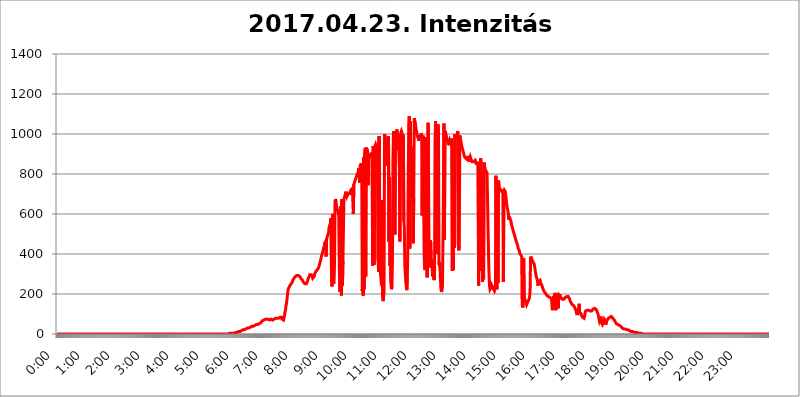
| Category | 2017.04.23. Intenzitás [W/m^2] |
|---|---|
| 0.0 | 0 |
| 0.0006944444444444445 | 0 |
| 0.001388888888888889 | 0 |
| 0.0020833333333333333 | 0 |
| 0.002777777777777778 | 0 |
| 0.003472222222222222 | 0 |
| 0.004166666666666667 | 0 |
| 0.004861111111111111 | 0 |
| 0.005555555555555556 | 0 |
| 0.0062499999999999995 | 0 |
| 0.006944444444444444 | 0 |
| 0.007638888888888889 | 0 |
| 0.008333333333333333 | 0 |
| 0.009027777777777779 | 0 |
| 0.009722222222222222 | 0 |
| 0.010416666666666666 | 0 |
| 0.011111111111111112 | 0 |
| 0.011805555555555555 | 0 |
| 0.012499999999999999 | 0 |
| 0.013194444444444444 | 0 |
| 0.013888888888888888 | 0 |
| 0.014583333333333332 | 0 |
| 0.015277777777777777 | 0 |
| 0.015972222222222224 | 0 |
| 0.016666666666666666 | 0 |
| 0.017361111111111112 | 0 |
| 0.018055555555555557 | 0 |
| 0.01875 | 0 |
| 0.019444444444444445 | 0 |
| 0.02013888888888889 | 0 |
| 0.020833333333333332 | 0 |
| 0.02152777777777778 | 0 |
| 0.022222222222222223 | 0 |
| 0.02291666666666667 | 0 |
| 0.02361111111111111 | 0 |
| 0.024305555555555556 | 0 |
| 0.024999999999999998 | 0 |
| 0.025694444444444447 | 0 |
| 0.02638888888888889 | 0 |
| 0.027083333333333334 | 0 |
| 0.027777777777777776 | 0 |
| 0.02847222222222222 | 0 |
| 0.029166666666666664 | 0 |
| 0.029861111111111113 | 0 |
| 0.030555555555555555 | 0 |
| 0.03125 | 0 |
| 0.03194444444444445 | 0 |
| 0.03263888888888889 | 0 |
| 0.03333333333333333 | 0 |
| 0.034027777777777775 | 0 |
| 0.034722222222222224 | 0 |
| 0.035416666666666666 | 0 |
| 0.036111111111111115 | 0 |
| 0.03680555555555556 | 0 |
| 0.0375 | 0 |
| 0.03819444444444444 | 0 |
| 0.03888888888888889 | 0 |
| 0.03958333333333333 | 0 |
| 0.04027777777777778 | 0 |
| 0.04097222222222222 | 0 |
| 0.041666666666666664 | 0 |
| 0.042361111111111106 | 0 |
| 0.04305555555555556 | 0 |
| 0.043750000000000004 | 0 |
| 0.044444444444444446 | 0 |
| 0.04513888888888889 | 0 |
| 0.04583333333333334 | 0 |
| 0.04652777777777778 | 0 |
| 0.04722222222222222 | 0 |
| 0.04791666666666666 | 0 |
| 0.04861111111111111 | 0 |
| 0.049305555555555554 | 0 |
| 0.049999999999999996 | 0 |
| 0.05069444444444445 | 0 |
| 0.051388888888888894 | 0 |
| 0.052083333333333336 | 0 |
| 0.05277777777777778 | 0 |
| 0.05347222222222222 | 0 |
| 0.05416666666666667 | 0 |
| 0.05486111111111111 | 0 |
| 0.05555555555555555 | 0 |
| 0.05625 | 0 |
| 0.05694444444444444 | 0 |
| 0.057638888888888885 | 0 |
| 0.05833333333333333 | 0 |
| 0.05902777777777778 | 0 |
| 0.059722222222222225 | 0 |
| 0.06041666666666667 | 0 |
| 0.061111111111111116 | 0 |
| 0.06180555555555556 | 0 |
| 0.0625 | 0 |
| 0.06319444444444444 | 0 |
| 0.06388888888888888 | 0 |
| 0.06458333333333334 | 0 |
| 0.06527777777777778 | 0 |
| 0.06597222222222222 | 0 |
| 0.06666666666666667 | 0 |
| 0.06736111111111111 | 0 |
| 0.06805555555555555 | 0 |
| 0.06874999999999999 | 0 |
| 0.06944444444444443 | 0 |
| 0.07013888888888889 | 0 |
| 0.07083333333333333 | 0 |
| 0.07152777777777779 | 0 |
| 0.07222222222222223 | 0 |
| 0.07291666666666667 | 0 |
| 0.07361111111111111 | 0 |
| 0.07430555555555556 | 0 |
| 0.075 | 0 |
| 0.07569444444444444 | 0 |
| 0.0763888888888889 | 0 |
| 0.07708333333333334 | 0 |
| 0.07777777777777778 | 0 |
| 0.07847222222222222 | 0 |
| 0.07916666666666666 | 0 |
| 0.0798611111111111 | 0 |
| 0.08055555555555556 | 0 |
| 0.08125 | 0 |
| 0.08194444444444444 | 0 |
| 0.08263888888888889 | 0 |
| 0.08333333333333333 | 0 |
| 0.08402777777777777 | 0 |
| 0.08472222222222221 | 0 |
| 0.08541666666666665 | 0 |
| 0.08611111111111112 | 0 |
| 0.08680555555555557 | 0 |
| 0.08750000000000001 | 0 |
| 0.08819444444444445 | 0 |
| 0.08888888888888889 | 0 |
| 0.08958333333333333 | 0 |
| 0.09027777777777778 | 0 |
| 0.09097222222222222 | 0 |
| 0.09166666666666667 | 0 |
| 0.09236111111111112 | 0 |
| 0.09305555555555556 | 0 |
| 0.09375 | 0 |
| 0.09444444444444444 | 0 |
| 0.09513888888888888 | 0 |
| 0.09583333333333333 | 0 |
| 0.09652777777777777 | 0 |
| 0.09722222222222222 | 0 |
| 0.09791666666666667 | 0 |
| 0.09861111111111111 | 0 |
| 0.09930555555555555 | 0 |
| 0.09999999999999999 | 0 |
| 0.10069444444444443 | 0 |
| 0.1013888888888889 | 0 |
| 0.10208333333333335 | 0 |
| 0.10277777777777779 | 0 |
| 0.10347222222222223 | 0 |
| 0.10416666666666667 | 0 |
| 0.10486111111111111 | 0 |
| 0.10555555555555556 | 0 |
| 0.10625 | 0 |
| 0.10694444444444444 | 0 |
| 0.1076388888888889 | 0 |
| 0.10833333333333334 | 0 |
| 0.10902777777777778 | 0 |
| 0.10972222222222222 | 0 |
| 0.1111111111111111 | 0 |
| 0.11180555555555556 | 0 |
| 0.11180555555555556 | 0 |
| 0.1125 | 0 |
| 0.11319444444444444 | 0 |
| 0.11388888888888889 | 0 |
| 0.11458333333333333 | 0 |
| 0.11527777777777777 | 0 |
| 0.11597222222222221 | 0 |
| 0.11666666666666665 | 0 |
| 0.1173611111111111 | 0 |
| 0.11805555555555557 | 0 |
| 0.11944444444444445 | 0 |
| 0.12013888888888889 | 0 |
| 0.12083333333333333 | 0 |
| 0.12152777777777778 | 0 |
| 0.12222222222222223 | 0 |
| 0.12291666666666667 | 0 |
| 0.12291666666666667 | 0 |
| 0.12361111111111112 | 0 |
| 0.12430555555555556 | 0 |
| 0.125 | 0 |
| 0.12569444444444444 | 0 |
| 0.12638888888888888 | 0 |
| 0.12708333333333333 | 0 |
| 0.16875 | 0 |
| 0.12847222222222224 | 0 |
| 0.12916666666666668 | 0 |
| 0.12986111111111112 | 0 |
| 0.13055555555555556 | 0 |
| 0.13125 | 0 |
| 0.13194444444444445 | 0 |
| 0.1326388888888889 | 0 |
| 0.13333333333333333 | 0 |
| 0.13402777777777777 | 0 |
| 0.13402777777777777 | 0 |
| 0.13472222222222222 | 0 |
| 0.13541666666666666 | 0 |
| 0.1361111111111111 | 0 |
| 0.13749999999999998 | 0 |
| 0.13819444444444443 | 0 |
| 0.1388888888888889 | 0 |
| 0.13958333333333334 | 0 |
| 0.14027777777777778 | 0 |
| 0.14097222222222222 | 0 |
| 0.14166666666666666 | 0 |
| 0.1423611111111111 | 0 |
| 0.14305555555555557 | 0 |
| 0.14375000000000002 | 0 |
| 0.14444444444444446 | 0 |
| 0.1451388888888889 | 0 |
| 0.1451388888888889 | 0 |
| 0.14652777777777778 | 0 |
| 0.14722222222222223 | 0 |
| 0.14791666666666667 | 0 |
| 0.1486111111111111 | 0 |
| 0.14930555555555555 | 0 |
| 0.15 | 0 |
| 0.15069444444444444 | 0 |
| 0.15138888888888888 | 0 |
| 0.15208333333333332 | 0 |
| 0.15277777777777776 | 0 |
| 0.15347222222222223 | 0 |
| 0.15416666666666667 | 0 |
| 0.15486111111111112 | 0 |
| 0.15555555555555556 | 0 |
| 0.15625 | 0 |
| 0.15694444444444444 | 0 |
| 0.15763888888888888 | 0 |
| 0.15833333333333333 | 0 |
| 0.15902777777777777 | 0 |
| 0.15972222222222224 | 0 |
| 0.16041666666666668 | 0 |
| 0.16111111111111112 | 0 |
| 0.16180555555555556 | 0 |
| 0.1625 | 0 |
| 0.16319444444444445 | 0 |
| 0.1638888888888889 | 0 |
| 0.16458333333333333 | 0 |
| 0.16527777777777777 | 0 |
| 0.16597222222222222 | 0 |
| 0.16666666666666666 | 0 |
| 0.1673611111111111 | 0 |
| 0.16805555555555554 | 0 |
| 0.16874999999999998 | 0 |
| 0.16944444444444443 | 0 |
| 0.17013888888888887 | 0 |
| 0.1708333333333333 | 0 |
| 0.17152777777777775 | 0 |
| 0.17222222222222225 | 0 |
| 0.1729166666666667 | 0 |
| 0.17361111111111113 | 0 |
| 0.17430555555555557 | 0 |
| 0.17500000000000002 | 0 |
| 0.17569444444444446 | 0 |
| 0.1763888888888889 | 0 |
| 0.17708333333333334 | 0 |
| 0.17777777777777778 | 0 |
| 0.17847222222222223 | 0 |
| 0.17916666666666667 | 0 |
| 0.1798611111111111 | 0 |
| 0.18055555555555555 | 0 |
| 0.18125 | 0 |
| 0.18194444444444444 | 0 |
| 0.1826388888888889 | 0 |
| 0.18333333333333335 | 0 |
| 0.1840277777777778 | 0 |
| 0.18472222222222223 | 0 |
| 0.18541666666666667 | 0 |
| 0.18611111111111112 | 0 |
| 0.18680555555555556 | 0 |
| 0.1875 | 0 |
| 0.18819444444444444 | 0 |
| 0.18888888888888888 | 0 |
| 0.18958333333333333 | 0 |
| 0.19027777777777777 | 0 |
| 0.1909722222222222 | 0 |
| 0.19166666666666665 | 0 |
| 0.19236111111111112 | 0 |
| 0.19305555555555554 | 0 |
| 0.19375 | 0 |
| 0.19444444444444445 | 0 |
| 0.1951388888888889 | 0 |
| 0.19583333333333333 | 0 |
| 0.19652777777777777 | 0 |
| 0.19722222222222222 | 0 |
| 0.19791666666666666 | 0 |
| 0.1986111111111111 | 0 |
| 0.19930555555555554 | 0 |
| 0.19999999999999998 | 0 |
| 0.20069444444444443 | 0 |
| 0.20138888888888887 | 0 |
| 0.2020833333333333 | 0 |
| 0.2027777777777778 | 0 |
| 0.2034722222222222 | 0 |
| 0.2041666666666667 | 0 |
| 0.20486111111111113 | 0 |
| 0.20555555555555557 | 0 |
| 0.20625000000000002 | 0 |
| 0.20694444444444446 | 0 |
| 0.2076388888888889 | 0 |
| 0.20833333333333334 | 0 |
| 0.20902777777777778 | 0 |
| 0.20972222222222223 | 0 |
| 0.21041666666666667 | 0 |
| 0.2111111111111111 | 0 |
| 0.21180555555555555 | 0 |
| 0.2125 | 0 |
| 0.21319444444444444 | 0 |
| 0.2138888888888889 | 0 |
| 0.21458333333333335 | 0 |
| 0.2152777777777778 | 0 |
| 0.21597222222222223 | 0 |
| 0.21666666666666667 | 0 |
| 0.21736111111111112 | 0 |
| 0.21805555555555556 | 0 |
| 0.21875 | 0 |
| 0.21944444444444444 | 0 |
| 0.22013888888888888 | 0 |
| 0.22083333333333333 | 0 |
| 0.22152777777777777 | 0 |
| 0.2222222222222222 | 0 |
| 0.22291666666666665 | 0 |
| 0.2236111111111111 | 0 |
| 0.22430555555555556 | 0 |
| 0.225 | 0 |
| 0.22569444444444445 | 0 |
| 0.2263888888888889 | 0 |
| 0.22708333333333333 | 0 |
| 0.22777777777777777 | 0 |
| 0.22847222222222222 | 0 |
| 0.22916666666666666 | 0 |
| 0.2298611111111111 | 0 |
| 0.23055555555555554 | 0 |
| 0.23124999999999998 | 0 |
| 0.23194444444444443 | 0 |
| 0.23263888888888887 | 0 |
| 0.2333333333333333 | 0 |
| 0.2340277777777778 | 0 |
| 0.2347222222222222 | 0 |
| 0.2354166666666667 | 0 |
| 0.23611111111111113 | 0 |
| 0.23680555555555557 | 0 |
| 0.23750000000000002 | 0 |
| 0.23819444444444446 | 0 |
| 0.2388888888888889 | 0 |
| 0.23958333333333334 | 0 |
| 0.24027777777777778 | 0 |
| 0.24097222222222223 | 0 |
| 0.24166666666666667 | 3.525 |
| 0.2423611111111111 | 3.525 |
| 0.24305555555555555 | 3.525 |
| 0.24375 | 3.525 |
| 0.24444444444444446 | 3.525 |
| 0.24513888888888888 | 3.525 |
| 0.24583333333333335 | 3.525 |
| 0.2465277777777778 | 3.525 |
| 0.24722222222222223 | 3.525 |
| 0.24791666666666667 | 3.525 |
| 0.24861111111111112 | 7.887 |
| 0.24930555555555556 | 7.887 |
| 0.25 | 7.887 |
| 0.25069444444444444 | 7.887 |
| 0.2513888888888889 | 7.887 |
| 0.2520833333333333 | 7.887 |
| 0.25277777777777777 | 7.887 |
| 0.2534722222222222 | 12.257 |
| 0.25416666666666665 | 12.257 |
| 0.2548611111111111 | 12.257 |
| 0.2555555555555556 | 12.257 |
| 0.25625000000000003 | 12.257 |
| 0.2569444444444445 | 12.257 |
| 0.2576388888888889 | 16.636 |
| 0.25833333333333336 | 16.636 |
| 0.2590277777777778 | 16.636 |
| 0.25972222222222224 | 16.636 |
| 0.2604166666666667 | 21.024 |
| 0.2611111111111111 | 21.024 |
| 0.26180555555555557 | 21.024 |
| 0.2625 | 21.024 |
| 0.26319444444444445 | 25.419 |
| 0.2638888888888889 | 25.419 |
| 0.26458333333333334 | 25.419 |
| 0.2652777777777778 | 25.419 |
| 0.2659722222222222 | 29.823 |
| 0.26666666666666666 | 29.823 |
| 0.2673611111111111 | 29.823 |
| 0.26805555555555555 | 29.823 |
| 0.26875 | 29.823 |
| 0.26944444444444443 | 29.823 |
| 0.2701388888888889 | 34.234 |
| 0.2708333333333333 | 34.234 |
| 0.27152777777777776 | 34.234 |
| 0.2722222222222222 | 38.653 |
| 0.27291666666666664 | 38.653 |
| 0.2736111111111111 | 38.653 |
| 0.2743055555555555 | 38.653 |
| 0.27499999999999997 | 38.653 |
| 0.27569444444444446 | 38.653 |
| 0.27638888888888885 | 43.079 |
| 0.27708333333333335 | 43.079 |
| 0.2777777777777778 | 43.079 |
| 0.27847222222222223 | 43.079 |
| 0.2791666666666667 | 47.511 |
| 0.2798611111111111 | 47.511 |
| 0.28055555555555556 | 47.511 |
| 0.28125 | 47.511 |
| 0.28194444444444444 | 51.951 |
| 0.2826388888888889 | 51.951 |
| 0.2833333333333333 | 51.951 |
| 0.28402777777777777 | 56.398 |
| 0.2847222222222222 | 56.398 |
| 0.28541666666666665 | 56.398 |
| 0.28611111111111115 | 60.85 |
| 0.28680555555555554 | 60.85 |
| 0.28750000000000003 | 65.31 |
| 0.2881944444444445 | 65.31 |
| 0.2888888888888889 | 69.775 |
| 0.28958333333333336 | 69.775 |
| 0.2902777777777778 | 74.246 |
| 0.29097222222222224 | 74.246 |
| 0.2916666666666667 | 74.246 |
| 0.2923611111111111 | 74.246 |
| 0.29305555555555557 | 74.246 |
| 0.29375 | 74.246 |
| 0.29444444444444445 | 74.246 |
| 0.2951388888888889 | 74.246 |
| 0.29583333333333334 | 74.246 |
| 0.2965277777777778 | 69.775 |
| 0.2972222222222222 | 69.775 |
| 0.29791666666666666 | 69.775 |
| 0.2986111111111111 | 74.246 |
| 0.29930555555555555 | 74.246 |
| 0.3 | 74.246 |
| 0.30069444444444443 | 74.246 |
| 0.3013888888888889 | 74.246 |
| 0.3020833333333333 | 69.775 |
| 0.30277777777777776 | 74.246 |
| 0.3034722222222222 | 74.246 |
| 0.30416666666666664 | 74.246 |
| 0.3048611111111111 | 78.722 |
| 0.3055555555555555 | 78.722 |
| 0.30624999999999997 | 78.722 |
| 0.3069444444444444 | 78.722 |
| 0.3076388888888889 | 78.722 |
| 0.30833333333333335 | 78.722 |
| 0.3090277777777778 | 78.722 |
| 0.30972222222222223 | 74.246 |
| 0.3104166666666667 | 78.722 |
| 0.3111111111111111 | 78.722 |
| 0.31180555555555556 | 83.205 |
| 0.3125 | 83.205 |
| 0.31319444444444444 | 83.205 |
| 0.3138888888888889 | 83.205 |
| 0.3145833333333333 | 83.205 |
| 0.31527777777777777 | 74.246 |
| 0.3159722222222222 | 69.775 |
| 0.31666666666666665 | 69.775 |
| 0.31736111111111115 | 69.775 |
| 0.31805555555555554 | 74.246 |
| 0.31875000000000003 | 92.184 |
| 0.3194444444444445 | 110.201 |
| 0.3201388888888889 | 119.235 |
| 0.32083333333333336 | 141.884 |
| 0.3215277777777778 | 150.964 |
| 0.32222222222222224 | 173.709 |
| 0.3229166666666667 | 178.264 |
| 0.3236111111111111 | 219.309 |
| 0.32430555555555557 | 228.436 |
| 0.325 | 233 |
| 0.32569444444444445 | 237.564 |
| 0.3263888888888889 | 242.127 |
| 0.32708333333333334 | 246.689 |
| 0.3277777777777778 | 251.251 |
| 0.3284722222222222 | 251.251 |
| 0.32916666666666666 | 255.813 |
| 0.3298611111111111 | 260.373 |
| 0.33055555555555555 | 269.49 |
| 0.33125 | 274.047 |
| 0.33194444444444443 | 278.603 |
| 0.3326388888888889 | 278.603 |
| 0.3333333333333333 | 283.156 |
| 0.3340277777777778 | 287.709 |
| 0.3347222222222222 | 292.259 |
| 0.3354166666666667 | 287.709 |
| 0.3361111111111111 | 292.259 |
| 0.3368055555555556 | 296.808 |
| 0.33749999999999997 | 292.259 |
| 0.33819444444444446 | 292.259 |
| 0.33888888888888885 | 292.259 |
| 0.33958333333333335 | 292.259 |
| 0.34027777777777773 | 287.709 |
| 0.34097222222222223 | 283.156 |
| 0.3416666666666666 | 278.603 |
| 0.3423611111111111 | 274.047 |
| 0.3430555555555555 | 274.047 |
| 0.34375 | 269.49 |
| 0.3444444444444445 | 269.49 |
| 0.3451388888888889 | 260.373 |
| 0.3458333333333334 | 255.813 |
| 0.34652777777777777 | 255.813 |
| 0.34722222222222227 | 251.251 |
| 0.34791666666666665 | 251.251 |
| 0.34861111111111115 | 251.251 |
| 0.34930555555555554 | 251.251 |
| 0.35000000000000003 | 255.813 |
| 0.3506944444444444 | 260.373 |
| 0.3513888888888889 | 269.49 |
| 0.3520833333333333 | 278.603 |
| 0.3527777777777778 | 283.156 |
| 0.3534722222222222 | 287.709 |
| 0.3541666666666667 | 296.808 |
| 0.3548611111111111 | 301.354 |
| 0.35555555555555557 | 301.354 |
| 0.35625 | 296.808 |
| 0.35694444444444445 | 292.259 |
| 0.3576388888888889 | 287.709 |
| 0.35833333333333334 | 278.603 |
| 0.3590277777777778 | 283.156 |
| 0.3597222222222222 | 283.156 |
| 0.36041666666666666 | 287.709 |
| 0.3611111111111111 | 301.354 |
| 0.36180555555555555 | 305.898 |
| 0.3625 | 305.898 |
| 0.36319444444444443 | 314.98 |
| 0.3638888888888889 | 314.98 |
| 0.3645833333333333 | 319.517 |
| 0.3652777777777778 | 324.052 |
| 0.3659722222222222 | 328.584 |
| 0.3666666666666667 | 333.113 |
| 0.3673611111111111 | 342.162 |
| 0.3680555555555556 | 351.198 |
| 0.36874999999999997 | 355.712 |
| 0.36944444444444446 | 369.23 |
| 0.37013888888888885 | 382.715 |
| 0.37083333333333335 | 391.685 |
| 0.37152777777777773 | 400.638 |
| 0.37222222222222223 | 409.574 |
| 0.3729166666666666 | 414.035 |
| 0.3736111111111111 | 427.39 |
| 0.3743055555555555 | 418.492 |
| 0.375 | 453.968 |
| 0.3756944444444445 | 449.551 |
| 0.3763888888888889 | 462.786 |
| 0.3770833333333334 | 387.202 |
| 0.37777777777777777 | 471.582 |
| 0.37847222222222227 | 484.735 |
| 0.37916666666666665 | 489.108 |
| 0.37986111111111115 | 480.356 |
| 0.38055555555555554 | 506.542 |
| 0.38125000000000003 | 532.513 |
| 0.3819444444444444 | 536.82 |
| 0.3826388888888889 | 549.704 |
| 0.3833333333333333 | 558.261 |
| 0.3840277777777778 | 579.542 |
| 0.3847222222222222 | 278.603 |
| 0.3854166666666667 | 237.564 |
| 0.3861111111111111 | 600.661 |
| 0.38680555555555557 | 489.108 |
| 0.3875 | 251.251 |
| 0.38819444444444445 | 260.373 |
| 0.3888888888888889 | 351.198 |
| 0.38958333333333334 | 663.019 |
| 0.3902777777777778 | 675.311 |
| 0.3909722222222222 | 658.909 |
| 0.39166666666666666 | 642.4 |
| 0.3923611111111111 | 625.784 |
| 0.39305555555555555 | 617.436 |
| 0.39375 | 613.252 |
| 0.39444444444444443 | 604.864 |
| 0.3951388888888889 | 613.252 |
| 0.3958333333333333 | 292.259 |
| 0.3965277777777778 | 210.182 |
| 0.3972222222222222 | 638.256 |
| 0.3979166666666667 | 588.009 |
| 0.3986111111111111 | 191.937 |
| 0.3993055555555556 | 675.311 |
| 0.39999999999999997 | 242.127 |
| 0.40069444444444446 | 364.728 |
| 0.40138888888888885 | 523.88 |
| 0.40208333333333335 | 675.311 |
| 0.40277777777777773 | 679.395 |
| 0.40347222222222223 | 691.608 |
| 0.4041666666666666 | 691.608 |
| 0.4048611111111111 | 711.832 |
| 0.4055555555555555 | 707.8 |
| 0.40625 | 687.544 |
| 0.4069444444444445 | 683.473 |
| 0.4076388888888889 | 683.473 |
| 0.4083333333333334 | 703.762 |
| 0.40902777777777777 | 703.762 |
| 0.40972222222222227 | 703.762 |
| 0.41041666666666665 | 703.762 |
| 0.41111111111111115 | 695.666 |
| 0.41180555555555554 | 719.877 |
| 0.41250000000000003 | 719.877 |
| 0.4131944444444444 | 719.877 |
| 0.4138888888888889 | 727.896 |
| 0.4145833333333333 | 723.889 |
| 0.4152777777777778 | 600.661 |
| 0.4159722222222222 | 747.834 |
| 0.4166666666666667 | 755.766 |
| 0.4173611111111111 | 759.723 |
| 0.41805555555555557 | 771.559 |
| 0.41875 | 775.492 |
| 0.41944444444444445 | 783.342 |
| 0.4201388888888889 | 795.074 |
| 0.42083333333333334 | 798.974 |
| 0.4215277777777778 | 802.868 |
| 0.4222222222222222 | 810.641 |
| 0.42291666666666666 | 829.981 |
| 0.4236111111111111 | 826.123 |
| 0.42430555555555555 | 755.766 |
| 0.425 | 841.526 |
| 0.42569444444444443 | 845.365 |
| 0.4263888888888889 | 853.029 |
| 0.4270833333333333 | 810.641 |
| 0.4277777777777778 | 214.746 |
| 0.4284722222222222 | 255.813 |
| 0.4291666666666667 | 191.937 |
| 0.4298611111111111 | 883.516 |
| 0.4305555555555556 | 223.873 |
| 0.43124999999999997 | 902.447 |
| 0.43194444444444446 | 928.819 |
| 0.43263888888888885 | 287.709 |
| 0.43333333333333335 | 932.576 |
| 0.43402777777777773 | 883.516 |
| 0.43472222222222223 | 925.06 |
| 0.4354166666666666 | 906.223 |
| 0.4361111111111111 | 743.859 |
| 0.4368055555555555 | 902.447 |
| 0.4375 | 894.885 |
| 0.4381944444444445 | 891.099 |
| 0.4388888888888889 | 894.885 |
| 0.4395833333333334 | 887.309 |
| 0.44027777777777777 | 887.309 |
| 0.44097222222222227 | 894.885 |
| 0.44166666666666665 | 909.996 |
| 0.44236111111111115 | 342.162 |
| 0.44305555555555554 | 940.082 |
| 0.44375000000000003 | 928.819 |
| 0.4444444444444444 | 346.682 |
| 0.4451388888888889 | 613.252 |
| 0.4458333333333333 | 940.082 |
| 0.4465277777777778 | 947.58 |
| 0.4472222222222222 | 940.082 |
| 0.4479166666666667 | 928.819 |
| 0.4486111111111111 | 921.298 |
| 0.44930555555555557 | 928.819 |
| 0.45 | 369.23 |
| 0.45069444444444445 | 310.44 |
| 0.4513888888888889 | 988.714 |
| 0.45208333333333334 | 378.224 |
| 0.4527777777777778 | 324.052 |
| 0.4534722222222222 | 296.808 |
| 0.45416666666666666 | 292.259 |
| 0.4548611111111111 | 242.127 |
| 0.45555555555555555 | 667.123 |
| 0.45625 | 187.378 |
| 0.45694444444444443 | 164.605 |
| 0.4576388888888889 | 182.82 |
| 0.4583333333333333 | 210.182 |
| 0.4590277777777778 | 999.916 |
| 0.4597222222222222 | 988.714 |
| 0.4604166666666667 | 981.244 |
| 0.4611111111111111 | 970.034 |
| 0.4618055555555556 | 966.295 |
| 0.46249999999999997 | 970.034 |
| 0.46319444444444446 | 841.526 |
| 0.46388888888888885 | 928.819 |
| 0.46458333333333335 | 988.714 |
| 0.46527777777777773 | 462.786 |
| 0.46597222222222223 | 783.342 |
| 0.4666666666666666 | 342.162 |
| 0.4673611111111111 | 378.224 |
| 0.4680555555555555 | 255.813 |
| 0.46875 | 223.873 |
| 0.4694444444444445 | 237.564 |
| 0.4701388888888889 | 369.23 |
| 0.4708333333333334 | 868.305 |
| 0.47152777777777777 | 1014.852 |
| 0.47222222222222227 | 1018.587 |
| 0.47291666666666665 | 810.641 |
| 0.47361111111111115 | 497.836 |
| 0.47430555555555554 | 996.182 |
| 0.47500000000000003 | 917.534 |
| 0.4756944444444444 | 1007.383 |
| 0.4763888888888889 | 1022.323 |
| 0.4770833333333333 | 996.182 |
| 0.4777777777777778 | 981.244 |
| 0.4784722222222222 | 984.98 |
| 0.4791666666666667 | 1003.65 |
| 0.4798611111111111 | 841.526 |
| 0.48055555555555557 | 462.786 |
| 0.48125 | 966.295 |
| 0.48194444444444445 | 1007.383 |
| 0.4826388888888889 | 1014.852 |
| 0.48333333333333334 | 1007.383 |
| 0.4840277777777778 | 996.182 |
| 0.4847222222222222 | 988.714 |
| 0.48541666666666666 | 996.182 |
| 0.4861111111111111 | 566.793 |
| 0.48680555555555555 | 532.513 |
| 0.4875 | 342.162 |
| 0.48819444444444443 | 301.354 |
| 0.4888888888888889 | 260.373 |
| 0.4895833333333333 | 237.564 |
| 0.4902777777777778 | 219.309 |
| 0.4909722222222222 | 283.156 |
| 0.4916666666666667 | 422.943 |
| 0.4923611111111111 | 818.392 |
| 0.4930555555555556 | 1041.019 |
| 0.49374999999999997 | 1089.873 |
| 0.49444444444444446 | 427.39 |
| 0.49513888888888885 | 1063.51 |
| 0.49583333333333335 | 868.305 |
| 0.49652777777777773 | 759.723 |
| 0.49722222222222223 | 932.576 |
| 0.4979166666666666 | 663.019 |
| 0.4986111111111111 | 872.114 |
| 0.4993055555555555 | 453.968 |
| 0.5 | 679.395 |
| 0.5006944444444444 | 1078.555 |
| 0.5013888888888889 | 1067.267 |
| 0.5020833333333333 | 1059.756 |
| 0.5027777777777778 | 1037.277 |
| 0.5034722222222222 | 1018.587 |
| 0.5041666666666667 | 1007.383 |
| 0.5048611111111111 | 992.448 |
| 0.5055555555555555 | 988.714 |
| 0.50625 | 981.244 |
| 0.5069444444444444 | 966.295 |
| 0.5076388888888889 | 988.714 |
| 0.5083333333333333 | 984.98 |
| 0.5090277777777777 | 992.448 |
| 0.5097222222222222 | 988.714 |
| 0.5104166666666666 | 1003.65 |
| 0.5111111111111112 | 996.182 |
| 0.5118055555555555 | 592.233 |
| 0.5125000000000001 | 977.508 |
| 0.5131944444444444 | 992.448 |
| 0.513888888888889 | 683.473 |
| 0.5145833333333333 | 396.164 |
| 0.5152777777777778 | 328.584 |
| 0.5159722222222222 | 319.517 |
| 0.5166666666666667 | 984.98 |
| 0.517361111111111 | 351.198 |
| 0.5180555555555556 | 319.517 |
| 0.5187499999999999 | 283.156 |
| 0.5194444444444445 | 328.584 |
| 0.5201388888888888 | 1056.004 |
| 0.5208333333333334 | 743.859 |
| 0.5215277777777778 | 378.224 |
| 0.5222222222222223 | 333.113 |
| 0.5229166666666667 | 369.23 |
| 0.5236111111111111 | 467.187 |
| 0.5243055555555556 | 391.685 |
| 0.525 | 364.728 |
| 0.5256944444444445 | 351.198 |
| 0.5263888888888889 | 292.259 |
| 0.5270833333333333 | 296.808 |
| 0.5277777777777778 | 283.156 |
| 0.5284722222222222 | 269.49 |
| 0.5291666666666667 | 292.259 |
| 0.5298611111111111 | 958.814 |
| 0.5305555555555556 | 1063.51 |
| 0.53125 | 996.182 |
| 0.5319444444444444 | 951.327 |
| 0.5326388888888889 | 400.638 |
| 0.5333333333333333 | 932.576 |
| 0.5340277777777778 | 1048.508 |
| 0.5347222222222222 | 992.448 |
| 0.5354166666666667 | 346.682 |
| 0.5361111111111111 | 360.221 |
| 0.5368055555555555 | 333.113 |
| 0.5375 | 269.49 |
| 0.5381944444444444 | 223.873 |
| 0.5388888888888889 | 210.182 |
| 0.5395833333333333 | 219.309 |
| 0.5402777777777777 | 242.127 |
| 0.5409722222222222 | 453.968 |
| 0.5416666666666666 | 715.858 |
| 0.5423611111111112 | 1052.255 |
| 0.5430555555555555 | 471.582 |
| 0.5437500000000001 | 1014.852 |
| 0.5444444444444444 | 1007.383 |
| 0.545138888888889 | 999.916 |
| 0.5458333333333333 | 988.714 |
| 0.5465277777777778 | 977.508 |
| 0.5472222222222222 | 970.034 |
| 0.5479166666666667 | 958.814 |
| 0.548611111111111 | 951.327 |
| 0.5493055555555556 | 943.832 |
| 0.5499999999999999 | 947.58 |
| 0.5506944444444445 | 970.034 |
| 0.5513888888888888 | 966.295 |
| 0.5520833333333334 | 958.814 |
| 0.5527777777777778 | 962.555 |
| 0.5534722222222223 | 977.508 |
| 0.5541666666666667 | 314.98 |
| 0.5548611111111111 | 791.169 |
| 0.5555555555555556 | 319.517 |
| 0.55625 | 743.859 |
| 0.5569444444444445 | 431.833 |
| 0.5576388888888889 | 999.916 |
| 0.5583333333333333 | 988.714 |
| 0.5590277777777778 | 992.448 |
| 0.5597222222222222 | 984.98 |
| 0.5604166666666667 | 977.508 |
| 0.5611111111111111 | 981.244 |
| 0.5618055555555556 | 1014.852 |
| 0.5625 | 440.702 |
| 0.5631944444444444 | 418.492 |
| 0.5638888888888889 | 440.702 |
| 0.5645833333333333 | 992.448 |
| 0.5652777777777778 | 977.508 |
| 0.5659722222222222 | 966.295 |
| 0.5666666666666667 | 955.071 |
| 0.5673611111111111 | 940.082 |
| 0.5680555555555555 | 928.819 |
| 0.56875 | 921.298 |
| 0.5694444444444444 | 909.996 |
| 0.5701388888888889 | 902.447 |
| 0.5708333333333333 | 891.099 |
| 0.5715277777777777 | 883.516 |
| 0.5722222222222222 | 883.516 |
| 0.5729166666666666 | 879.719 |
| 0.5736111111111112 | 875.918 |
| 0.5743055555555555 | 883.516 |
| 0.5750000000000001 | 883.516 |
| 0.5756944444444444 | 887.309 |
| 0.576388888888889 | 883.516 |
| 0.5770833333333333 | 883.516 |
| 0.5777777777777778 | 860.676 |
| 0.5784722222222222 | 879.719 |
| 0.5791666666666667 | 887.309 |
| 0.579861111111111 | 879.719 |
| 0.5805555555555556 | 872.114 |
| 0.5812499999999999 | 868.305 |
| 0.5819444444444445 | 860.676 |
| 0.5826388888888888 | 860.676 |
| 0.5833333333333334 | 860.676 |
| 0.5840277777777778 | 860.676 |
| 0.5847222222222223 | 860.676 |
| 0.5854166666666667 | 864.493 |
| 0.5861111111111111 | 868.305 |
| 0.5868055555555556 | 860.676 |
| 0.5875 | 853.029 |
| 0.5881944444444445 | 853.029 |
| 0.5888888888888889 | 853.029 |
| 0.5895833333333333 | 853.029 |
| 0.5902777777777778 | 860.676 |
| 0.5909722222222222 | 242.127 |
| 0.5916666666666667 | 853.029 |
| 0.5923611111111111 | 314.98 |
| 0.5930555555555556 | 314.98 |
| 0.59375 | 879.719 |
| 0.5944444444444444 | 853.029 |
| 0.5951388888888889 | 856.855 |
| 0.5958333333333333 | 856.855 |
| 0.5965277777777778 | 260.373 |
| 0.5972222222222222 | 806.757 |
| 0.5979166666666667 | 274.047 |
| 0.5986111111111111 | 856.855 |
| 0.5993055555555555 | 841.526 |
| 0.6 | 829.981 |
| 0.6006944444444444 | 818.392 |
| 0.6013888888888889 | 818.392 |
| 0.6020833333333333 | 814.519 |
| 0.6027777777777777 | 806.757 |
| 0.6034722222222222 | 802.868 |
| 0.6041666666666666 | 806.757 |
| 0.6048611111111112 | 405.108 |
| 0.6055555555555555 | 301.354 |
| 0.6062500000000001 | 242.127 |
| 0.6069444444444444 | 223.873 |
| 0.607638888888889 | 223.873 |
| 0.6083333333333333 | 233 |
| 0.6090277777777778 | 246.689 |
| 0.6097222222222222 | 242.127 |
| 0.6104166666666667 | 237.564 |
| 0.611111111111111 | 233 |
| 0.6118055555555556 | 223.873 |
| 0.6124999999999999 | 219.309 |
| 0.6131944444444445 | 214.746 |
| 0.6138888888888888 | 219.309 |
| 0.6145833333333334 | 228.436 |
| 0.6152777777777778 | 791.169 |
| 0.6159722222222223 | 287.709 |
| 0.6166666666666667 | 223.873 |
| 0.6173611111111111 | 675.311 |
| 0.6180555555555556 | 255.813 |
| 0.61875 | 767.62 |
| 0.6194444444444445 | 751.803 |
| 0.6201388888888889 | 731.896 |
| 0.6208333333333333 | 719.877 |
| 0.6215277777777778 | 719.877 |
| 0.6222222222222222 | 719.877 |
| 0.6229166666666667 | 719.877 |
| 0.6236111111111111 | 711.832 |
| 0.6243055555555556 | 707.8 |
| 0.625 | 703.762 |
| 0.6256944444444444 | 260.373 |
| 0.6263888888888889 | 711.832 |
| 0.6270833333333333 | 719.877 |
| 0.6277777777777778 | 719.877 |
| 0.6284722222222222 | 711.832 |
| 0.6291666666666667 | 691.608 |
| 0.6298611111111111 | 667.123 |
| 0.6305555555555555 | 646.537 |
| 0.63125 | 629.948 |
| 0.6319444444444444 | 617.436 |
| 0.6326388888888889 | 604.864 |
| 0.6333333333333333 | 571.049 |
| 0.6340277777777777 | 588.009 |
| 0.6347222222222222 | 579.542 |
| 0.6354166666666666 | 575.299 |
| 0.6361111111111112 | 566.793 |
| 0.6368055555555555 | 553.986 |
| 0.6375000000000001 | 541.121 |
| 0.6381944444444444 | 536.82 |
| 0.638888888888889 | 523.88 |
| 0.6395833333333333 | 515.223 |
| 0.6402777777777778 | 506.542 |
| 0.6409722222222222 | 497.836 |
| 0.6416666666666667 | 489.108 |
| 0.642361111111111 | 480.356 |
| 0.6430555555555556 | 471.582 |
| 0.6437499999999999 | 462.786 |
| 0.6444444444444445 | 458.38 |
| 0.6451388888888888 | 449.551 |
| 0.6458333333333334 | 440.702 |
| 0.6465277777777778 | 427.39 |
| 0.6472222222222223 | 427.39 |
| 0.6479166666666667 | 418.492 |
| 0.6486111111111111 | 405.108 |
| 0.6493055555555556 | 405.108 |
| 0.65 | 396.164 |
| 0.6506944444444445 | 391.685 |
| 0.6513888888888889 | 387.202 |
| 0.6520833333333333 | 146.423 |
| 0.6527777777777778 | 132.814 |
| 0.6534722222222222 | 146.423 |
| 0.6541666666666667 | 378.224 |
| 0.6548611111111111 | 191.937 |
| 0.6555555555555556 | 178.264 |
| 0.65625 | 169.156 |
| 0.6569444444444444 | 164.605 |
| 0.6576388888888889 | 155.509 |
| 0.6583333333333333 | 146.423 |
| 0.6590277777777778 | 146.423 |
| 0.6597222222222222 | 150.964 |
| 0.6604166666666667 | 164.605 |
| 0.6611111111111111 | 169.156 |
| 0.6618055555555555 | 173.709 |
| 0.6625 | 187.378 |
| 0.6631944444444444 | 219.309 |
| 0.6638888888888889 | 387.202 |
| 0.6645833333333333 | 382.715 |
| 0.6652777777777777 | 378.224 |
| 0.6659722222222222 | 369.23 |
| 0.6666666666666666 | 364.728 |
| 0.6673611111111111 | 360.221 |
| 0.6680555555555556 | 360.221 |
| 0.6687500000000001 | 351.198 |
| 0.6694444444444444 | 337.639 |
| 0.6701388888888888 | 324.052 |
| 0.6708333333333334 | 305.898 |
| 0.6715277777777778 | 292.259 |
| 0.6722222222222222 | 283.156 |
| 0.6729166666666666 | 274.047 |
| 0.6736111111111112 | 264.932 |
| 0.6743055555555556 | 242.127 |
| 0.6749999999999999 | 264.932 |
| 0.6756944444444444 | 269.49 |
| 0.6763888888888889 | 269.49 |
| 0.6770833333333334 | 269.49 |
| 0.6777777777777777 | 260.373 |
| 0.6784722222222223 | 251.251 |
| 0.6791666666666667 | 246.689 |
| 0.6798611111111111 | 242.127 |
| 0.6805555555555555 | 233 |
| 0.68125 | 228.436 |
| 0.6819444444444445 | 219.309 |
| 0.6826388888888889 | 214.746 |
| 0.6833333333333332 | 210.182 |
| 0.6840277777777778 | 205.62 |
| 0.6847222222222222 | 205.62 |
| 0.6854166666666667 | 201.058 |
| 0.686111111111111 | 196.497 |
| 0.6868055555555556 | 191.937 |
| 0.6875 | 191.937 |
| 0.6881944444444444 | 187.378 |
| 0.688888888888889 | 187.378 |
| 0.6895833333333333 | 182.82 |
| 0.6902777777777778 | 182.82 |
| 0.6909722222222222 | 182.82 |
| 0.6916666666666668 | 182.82 |
| 0.6923611111111111 | 178.264 |
| 0.6930555555555555 | 178.264 |
| 0.69375 | 178.264 |
| 0.6944444444444445 | 119.235 |
| 0.6951388888888889 | 178.264 |
| 0.6958333333333333 | 173.709 |
| 0.6965277777777777 | 182.82 |
| 0.6972222222222223 | 191.937 |
| 0.6979166666666666 | 205.62 |
| 0.6986111111111111 | 201.058 |
| 0.6993055555555556 | 119.235 |
| 0.7000000000000001 | 191.937 |
| 0.7006944444444444 | 196.497 |
| 0.7013888888888888 | 191.937 |
| 0.7020833333333334 | 196.497 |
| 0.7027777777777778 | 128.284 |
| 0.7034722222222222 | 196.497 |
| 0.7041666666666666 | 196.497 |
| 0.7048611111111112 | 191.937 |
| 0.7055555555555556 | 191.937 |
| 0.7062499999999999 | 182.82 |
| 0.7069444444444444 | 182.82 |
| 0.7076388888888889 | 178.264 |
| 0.7083333333333334 | 173.709 |
| 0.7090277777777777 | 173.709 |
| 0.7097222222222223 | 173.709 |
| 0.7104166666666667 | 173.709 |
| 0.7111111111111111 | 173.709 |
| 0.7118055555555555 | 178.264 |
| 0.7125 | 182.82 |
| 0.7131944444444445 | 182.82 |
| 0.7138888888888889 | 182.82 |
| 0.7145833333333332 | 187.378 |
| 0.7152777777777778 | 182.82 |
| 0.7159722222222222 | 182.82 |
| 0.7166666666666667 | 187.378 |
| 0.717361111111111 | 187.378 |
| 0.7180555555555556 | 182.82 |
| 0.71875 | 173.709 |
| 0.7194444444444444 | 164.605 |
| 0.720138888888889 | 164.605 |
| 0.7208333333333333 | 155.509 |
| 0.7215277777777778 | 150.964 |
| 0.7222222222222222 | 146.423 |
| 0.7229166666666668 | 141.884 |
| 0.7236111111111111 | 141.884 |
| 0.7243055555555555 | 141.884 |
| 0.725 | 141.884 |
| 0.7256944444444445 | 132.814 |
| 0.7263888888888889 | 132.814 |
| 0.7270833333333333 | 132.814 |
| 0.7277777777777777 | 114.716 |
| 0.7284722222222223 | 101.184 |
| 0.7291666666666666 | 96.682 |
| 0.7298611111111111 | 96.682 |
| 0.7305555555555556 | 101.184 |
| 0.7312500000000001 | 105.69 |
| 0.7319444444444444 | 150.964 |
| 0.7326388888888888 | 110.201 |
| 0.7333333333333334 | 110.201 |
| 0.7340277777777778 | 105.69 |
| 0.7347222222222222 | 101.184 |
| 0.7354166666666666 | 92.184 |
| 0.7361111111111112 | 87.692 |
| 0.7368055555555556 | 83.205 |
| 0.7374999999999999 | 83.205 |
| 0.7381944444444444 | 83.205 |
| 0.7388888888888889 | 78.722 |
| 0.7395833333333334 | 78.722 |
| 0.7402777777777777 | 78.722 |
| 0.7409722222222223 | 114.716 |
| 0.7416666666666667 | 114.716 |
| 0.7423611111111111 | 119.235 |
| 0.7430555555555555 | 119.235 |
| 0.74375 | 119.235 |
| 0.7444444444444445 | 119.235 |
| 0.7451388888888889 | 119.235 |
| 0.7458333333333332 | 119.235 |
| 0.7465277777777778 | 114.716 |
| 0.7472222222222222 | 114.716 |
| 0.7479166666666667 | 110.201 |
| 0.748611111111111 | 110.201 |
| 0.7493055555555556 | 114.716 |
| 0.75 | 119.235 |
| 0.7506944444444444 | 119.235 |
| 0.751388888888889 | 123.758 |
| 0.7520833333333333 | 128.284 |
| 0.7527777777777778 | 128.284 |
| 0.7534722222222222 | 128.284 |
| 0.7541666666666668 | 128.284 |
| 0.7548611111111111 | 128.284 |
| 0.7555555555555555 | 123.758 |
| 0.75625 | 119.235 |
| 0.7569444444444445 | 114.716 |
| 0.7576388888888889 | 110.201 |
| 0.7583333333333333 | 101.184 |
| 0.7590277777777777 | 101.184 |
| 0.7597222222222223 | 96.682 |
| 0.7604166666666666 | 65.31 |
| 0.7611111111111111 | 60.85 |
| 0.7618055555555556 | 69.775 |
| 0.7625000000000001 | 87.692 |
| 0.7631944444444444 | 56.398 |
| 0.7638888888888888 | 51.951 |
| 0.7645833333333334 | 47.511 |
| 0.7652777777777778 | 47.511 |
| 0.7659722222222222 | 51.951 |
| 0.7666666666666666 | 69.775 |
| 0.7673611111111112 | 60.85 |
| 0.7680555555555556 | 47.511 |
| 0.7687499999999999 | 56.398 |
| 0.7694444444444444 | 47.511 |
| 0.7701388888888889 | 60.85 |
| 0.7708333333333334 | 65.31 |
| 0.7715277777777777 | 69.775 |
| 0.7722222222222223 | 74.246 |
| 0.7729166666666667 | 78.722 |
| 0.7736111111111111 | 78.722 |
| 0.7743055555555555 | 83.205 |
| 0.775 | 83.205 |
| 0.7756944444444445 | 87.692 |
| 0.7763888888888889 | 87.692 |
| 0.7770833333333332 | 87.692 |
| 0.7777777777777778 | 83.205 |
| 0.7784722222222222 | 83.205 |
| 0.7791666666666667 | 78.722 |
| 0.779861111111111 | 74.246 |
| 0.7805555555555556 | 74.246 |
| 0.78125 | 69.775 |
| 0.7819444444444444 | 65.31 |
| 0.782638888888889 | 60.85 |
| 0.7833333333333333 | 56.398 |
| 0.7840277777777778 | 51.951 |
| 0.7847222222222222 | 51.951 |
| 0.7854166666666668 | 51.951 |
| 0.7861111111111111 | 47.511 |
| 0.7868055555555555 | 47.511 |
| 0.7875 | 47.511 |
| 0.7881944444444445 | 43.079 |
| 0.7888888888888889 | 38.653 |
| 0.7895833333333333 | 38.653 |
| 0.7902777777777777 | 38.653 |
| 0.7909722222222223 | 34.234 |
| 0.7916666666666666 | 34.234 |
| 0.7923611111111111 | 29.823 |
| 0.7930555555555556 | 29.823 |
| 0.7937500000000001 | 29.823 |
| 0.7944444444444444 | 25.419 |
| 0.7951388888888888 | 25.419 |
| 0.7958333333333334 | 25.419 |
| 0.7965277777777778 | 25.419 |
| 0.7972222222222222 | 21.024 |
| 0.7979166666666666 | 21.024 |
| 0.7986111111111112 | 21.024 |
| 0.7993055555555556 | 21.024 |
| 0.7999999999999999 | 21.024 |
| 0.8006944444444444 | 21.024 |
| 0.8013888888888889 | 16.636 |
| 0.8020833333333334 | 16.636 |
| 0.8027777777777777 | 16.636 |
| 0.8034722222222223 | 16.636 |
| 0.8041666666666667 | 12.257 |
| 0.8048611111111111 | 12.257 |
| 0.8055555555555555 | 12.257 |
| 0.80625 | 12.257 |
| 0.8069444444444445 | 12.257 |
| 0.8076388888888889 | 12.257 |
| 0.8083333333333332 | 12.257 |
| 0.8090277777777778 | 7.887 |
| 0.8097222222222222 | 7.887 |
| 0.8104166666666667 | 7.887 |
| 0.811111111111111 | 7.887 |
| 0.8118055555555556 | 7.887 |
| 0.8125 | 7.887 |
| 0.8131944444444444 | 7.887 |
| 0.813888888888889 | 3.525 |
| 0.8145833333333333 | 3.525 |
| 0.8152777777777778 | 3.525 |
| 0.8159722222222222 | 3.525 |
| 0.8166666666666668 | 3.525 |
| 0.8173611111111111 | 3.525 |
| 0.8180555555555555 | 3.525 |
| 0.81875 | 3.525 |
| 0.8194444444444445 | 3.525 |
| 0.8201388888888889 | 0 |
| 0.8208333333333333 | 0 |
| 0.8215277777777777 | 0 |
| 0.8222222222222223 | 0 |
| 0.8229166666666666 | 0 |
| 0.8236111111111111 | 0 |
| 0.8243055555555556 | 0 |
| 0.8250000000000001 | 0 |
| 0.8256944444444444 | 0 |
| 0.8263888888888888 | 0 |
| 0.8270833333333334 | 0 |
| 0.8277777777777778 | 0 |
| 0.8284722222222222 | 0 |
| 0.8291666666666666 | 0 |
| 0.8298611111111112 | 0 |
| 0.8305555555555556 | 0 |
| 0.8312499999999999 | 0 |
| 0.8319444444444444 | 0 |
| 0.8326388888888889 | 0 |
| 0.8333333333333334 | 0 |
| 0.8340277777777777 | 0 |
| 0.8347222222222223 | 0 |
| 0.8354166666666667 | 0 |
| 0.8361111111111111 | 0 |
| 0.8368055555555555 | 0 |
| 0.8375 | 0 |
| 0.8381944444444445 | 0 |
| 0.8388888888888889 | 0 |
| 0.8395833333333332 | 0 |
| 0.8402777777777778 | 0 |
| 0.8409722222222222 | 0 |
| 0.8416666666666667 | 0 |
| 0.842361111111111 | 0 |
| 0.8430555555555556 | 0 |
| 0.84375 | 0 |
| 0.8444444444444444 | 0 |
| 0.845138888888889 | 0 |
| 0.8458333333333333 | 0 |
| 0.8465277777777778 | 0 |
| 0.8472222222222222 | 0 |
| 0.8479166666666668 | 0 |
| 0.8486111111111111 | 0 |
| 0.8493055555555555 | 0 |
| 0.85 | 0 |
| 0.8506944444444445 | 0 |
| 0.8513888888888889 | 0 |
| 0.8520833333333333 | 0 |
| 0.8527777777777777 | 0 |
| 0.8534722222222223 | 0 |
| 0.8541666666666666 | 0 |
| 0.8548611111111111 | 0 |
| 0.8555555555555556 | 0 |
| 0.8562500000000001 | 0 |
| 0.8569444444444444 | 0 |
| 0.8576388888888888 | 0 |
| 0.8583333333333334 | 0 |
| 0.8590277777777778 | 0 |
| 0.8597222222222222 | 0 |
| 0.8604166666666666 | 0 |
| 0.8611111111111112 | 0 |
| 0.8618055555555556 | 0 |
| 0.8624999999999999 | 0 |
| 0.8631944444444444 | 0 |
| 0.8638888888888889 | 0 |
| 0.8645833333333334 | 0 |
| 0.8652777777777777 | 0 |
| 0.8659722222222223 | 0 |
| 0.8666666666666667 | 0 |
| 0.8673611111111111 | 0 |
| 0.8680555555555555 | 0 |
| 0.86875 | 0 |
| 0.8694444444444445 | 0 |
| 0.8701388888888889 | 0 |
| 0.8708333333333332 | 0 |
| 0.8715277777777778 | 0 |
| 0.8722222222222222 | 0 |
| 0.8729166666666667 | 0 |
| 0.873611111111111 | 0 |
| 0.8743055555555556 | 0 |
| 0.875 | 0 |
| 0.8756944444444444 | 0 |
| 0.876388888888889 | 0 |
| 0.8770833333333333 | 0 |
| 0.8777777777777778 | 0 |
| 0.8784722222222222 | 0 |
| 0.8791666666666668 | 0 |
| 0.8798611111111111 | 0 |
| 0.8805555555555555 | 0 |
| 0.88125 | 0 |
| 0.8819444444444445 | 0 |
| 0.8826388888888889 | 0 |
| 0.8833333333333333 | 0 |
| 0.8840277777777777 | 0 |
| 0.8847222222222223 | 0 |
| 0.8854166666666666 | 0 |
| 0.8861111111111111 | 0 |
| 0.8868055555555556 | 0 |
| 0.8875000000000001 | 0 |
| 0.8881944444444444 | 0 |
| 0.8888888888888888 | 0 |
| 0.8895833333333334 | 0 |
| 0.8902777777777778 | 0 |
| 0.8909722222222222 | 0 |
| 0.8916666666666666 | 0 |
| 0.8923611111111112 | 0 |
| 0.8930555555555556 | 0 |
| 0.8937499999999999 | 0 |
| 0.8944444444444444 | 0 |
| 0.8951388888888889 | 0 |
| 0.8958333333333334 | 0 |
| 0.8965277777777777 | 0 |
| 0.8972222222222223 | 0 |
| 0.8979166666666667 | 0 |
| 0.8986111111111111 | 0 |
| 0.8993055555555555 | 0 |
| 0.9 | 0 |
| 0.9006944444444445 | 0 |
| 0.9013888888888889 | 0 |
| 0.9020833333333332 | 0 |
| 0.9027777777777778 | 0 |
| 0.9034722222222222 | 0 |
| 0.9041666666666667 | 0 |
| 0.904861111111111 | 0 |
| 0.9055555555555556 | 0 |
| 0.90625 | 0 |
| 0.9069444444444444 | 0 |
| 0.907638888888889 | 0 |
| 0.9083333333333333 | 0 |
| 0.9090277777777778 | 0 |
| 0.9097222222222222 | 0 |
| 0.9104166666666668 | 0 |
| 0.9111111111111111 | 0 |
| 0.9118055555555555 | 0 |
| 0.9125 | 0 |
| 0.9131944444444445 | 0 |
| 0.9138888888888889 | 0 |
| 0.9145833333333333 | 0 |
| 0.9152777777777777 | 0 |
| 0.9159722222222223 | 0 |
| 0.9166666666666666 | 0 |
| 0.9173611111111111 | 0 |
| 0.9180555555555556 | 0 |
| 0.9187500000000001 | 0 |
| 0.9194444444444444 | 0 |
| 0.9201388888888888 | 0 |
| 0.9208333333333334 | 0 |
| 0.9215277777777778 | 0 |
| 0.9222222222222222 | 0 |
| 0.9229166666666666 | 0 |
| 0.9236111111111112 | 0 |
| 0.9243055555555556 | 0 |
| 0.9249999999999999 | 0 |
| 0.9256944444444444 | 0 |
| 0.9263888888888889 | 0 |
| 0.9270833333333334 | 0 |
| 0.9277777777777777 | 0 |
| 0.9284722222222223 | 0 |
| 0.9291666666666667 | 0 |
| 0.9298611111111111 | 0 |
| 0.9305555555555555 | 0 |
| 0.93125 | 0 |
| 0.9319444444444445 | 0 |
| 0.9326388888888889 | 0 |
| 0.9333333333333332 | 0 |
| 0.9340277777777778 | 0 |
| 0.9347222222222222 | 0 |
| 0.9354166666666667 | 0 |
| 0.936111111111111 | 0 |
| 0.9368055555555556 | 0 |
| 0.9375 | 0 |
| 0.9381944444444444 | 0 |
| 0.938888888888889 | 0 |
| 0.9395833333333333 | 0 |
| 0.9402777777777778 | 0 |
| 0.9409722222222222 | 0 |
| 0.9416666666666668 | 0 |
| 0.9423611111111111 | 0 |
| 0.9430555555555555 | 0 |
| 0.94375 | 0 |
| 0.9444444444444445 | 0 |
| 0.9451388888888889 | 0 |
| 0.9458333333333333 | 0 |
| 0.9465277777777777 | 0 |
| 0.9472222222222223 | 0 |
| 0.9479166666666666 | 0 |
| 0.9486111111111111 | 0 |
| 0.9493055555555556 | 0 |
| 0.9500000000000001 | 0 |
| 0.9506944444444444 | 0 |
| 0.9513888888888888 | 0 |
| 0.9520833333333334 | 0 |
| 0.9527777777777778 | 0 |
| 0.9534722222222222 | 0 |
| 0.9541666666666666 | 0 |
| 0.9548611111111112 | 0 |
| 0.9555555555555556 | 0 |
| 0.9562499999999999 | 0 |
| 0.9569444444444444 | 0 |
| 0.9576388888888889 | 0 |
| 0.9583333333333334 | 0 |
| 0.9590277777777777 | 0 |
| 0.9597222222222223 | 0 |
| 0.9604166666666667 | 0 |
| 0.9611111111111111 | 0 |
| 0.9618055555555555 | 0 |
| 0.9625 | 0 |
| 0.9631944444444445 | 0 |
| 0.9638888888888889 | 0 |
| 0.9645833333333332 | 0 |
| 0.9652777777777778 | 0 |
| 0.9659722222222222 | 0 |
| 0.9666666666666667 | 0 |
| 0.967361111111111 | 0 |
| 0.9680555555555556 | 0 |
| 0.96875 | 0 |
| 0.9694444444444444 | 0 |
| 0.970138888888889 | 0 |
| 0.9708333333333333 | 0 |
| 0.9715277777777778 | 0 |
| 0.9722222222222222 | 0 |
| 0.9729166666666668 | 0 |
| 0.9736111111111111 | 0 |
| 0.9743055555555555 | 0 |
| 0.975 | 0 |
| 0.9756944444444445 | 0 |
| 0.9763888888888889 | 0 |
| 0.9770833333333333 | 0 |
| 0.9777777777777777 | 0 |
| 0.9784722222222223 | 0 |
| 0.9791666666666666 | 0 |
| 0.9798611111111111 | 0 |
| 0.9805555555555556 | 0 |
| 0.9812500000000001 | 0 |
| 0.9819444444444444 | 0 |
| 0.9826388888888888 | 0 |
| 0.9833333333333334 | 0 |
| 0.9840277777777778 | 0 |
| 0.9847222222222222 | 0 |
| 0.9854166666666666 | 0 |
| 0.9861111111111112 | 0 |
| 0.9868055555555556 | 0 |
| 0.9874999999999999 | 0 |
| 0.9881944444444444 | 0 |
| 0.9888888888888889 | 0 |
| 0.9895833333333334 | 0 |
| 0.9902777777777777 | 0 |
| 0.9909722222222223 | 0 |
| 0.9916666666666667 | 0 |
| 0.9923611111111111 | 0 |
| 0.9930555555555555 | 0 |
| 0.99375 | 0 |
| 0.9944444444444445 | 0 |
| 0.9951388888888889 | 0 |
| 0.9958333333333332 | 0 |
| 0.9965277777777778 | 0 |
| 0.9972222222222222 | 0 |
| 0.9979166666666667 | 0 |
| 0.998611111111111 | 0 |
| 0.9993055555555556 | 0 |